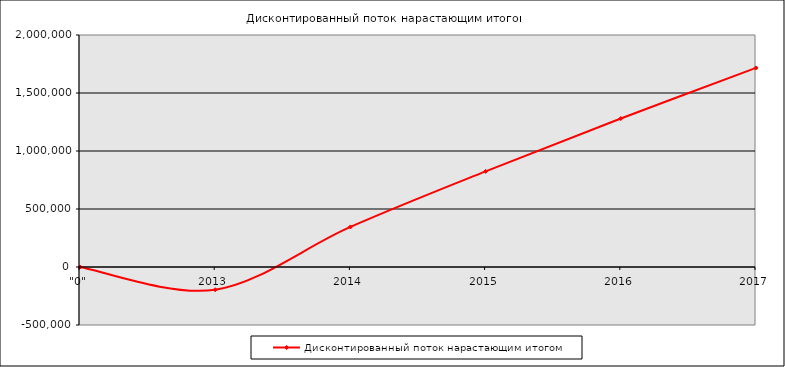
| Category | Дисконтированный поток нарастающим итогом |
|---|---|
| "0" | 0 |
| 2013 | -196162.528 |
| 2014 | 345481.139 |
| 2015 | 824541.202 |
| 2016 | 1279901.061 |
| 2017 | 1716327.635 |